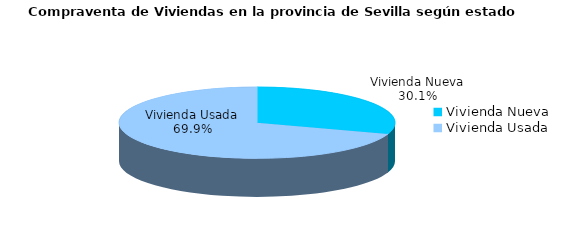
| Category | Series 0 | Series 1 |
|---|---|---|
| Vivienda Nueva | 341 | 0.301 |
| Vivienda Usada | 791 | 0.699 |